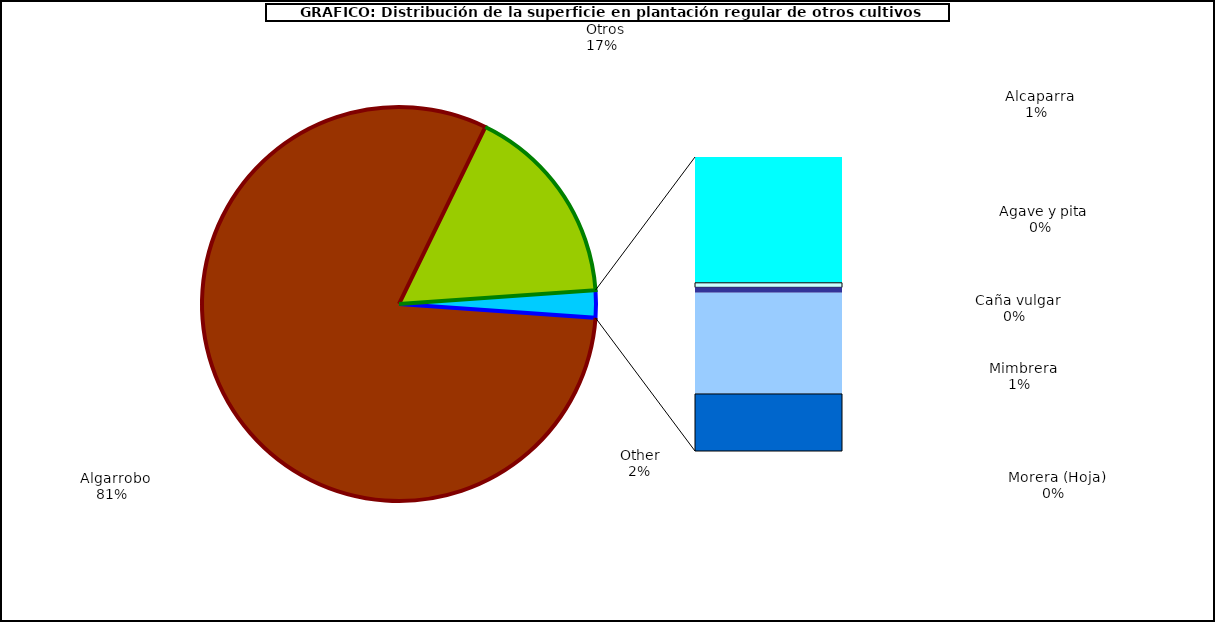
| Category | Series 0 |
|---|---|
|   Algarrobo | 39889 |
|   Otros | 8192 |
|   Alcaparra | 472 |
|   Agave y pita | 17 |
|   Caña vulgar | 20 |
|   Mimbrera | 380 |
|   Morera (Hoja) | 214 |